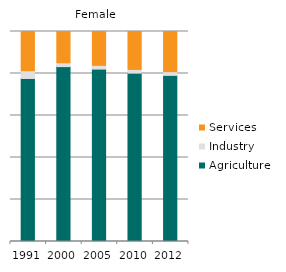
| Category | Agriculture | Industry | Services |
|---|---|---|---|
| 1991.0 | 77.637 | 3.163 | 19.2 |
| 2000.0 | 83.281 | 1.3 | 15.419 |
| 2005.0 | 82.093 | 1.286 | 16.621 |
| 2010.0 | 80.172 | 1.289 | 18.539 |
| 2012.0 | 79.099 | 1.325 | 19.575 |